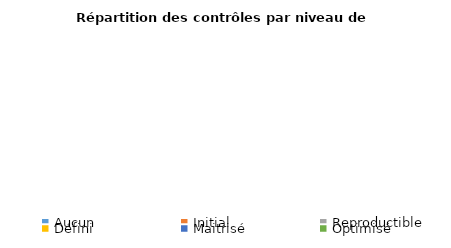
| Category | Series 0 |
|---|---|
| Aucun | 0 |
| Initial | 0 |
| Reproductible | 0 |
| Défini | 0 |
| Maitrisé | 0 |
| Optimisé | 0 |